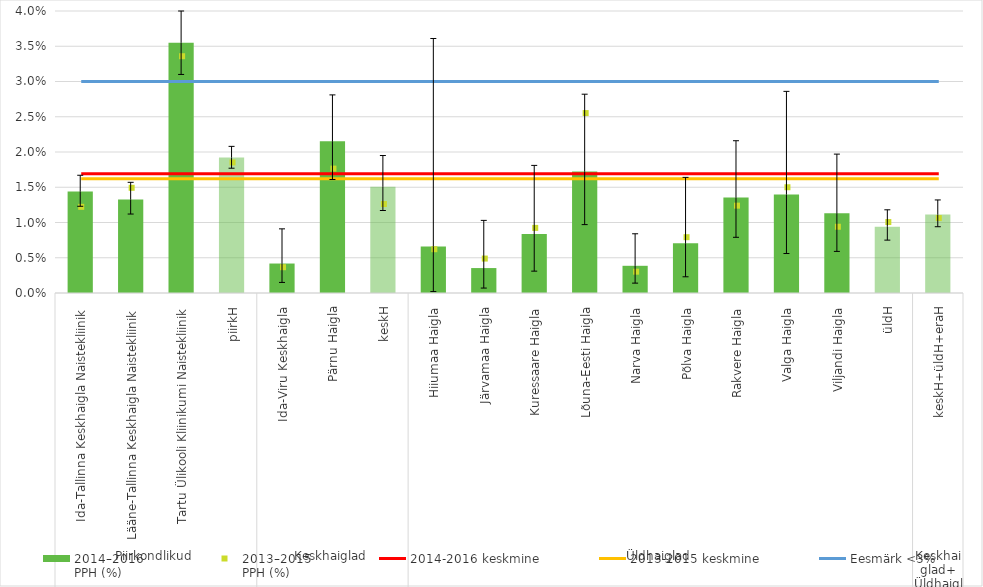
| Category | 2014–2016
PPH (%) |
|---|---|
| 0 | 0.014 |
| 1 | 0.013 |
| 2 | 0.036 |
| 3 | 0.019 |
| 4 | 0.004 |
| 5 | 0.022 |
| 6 | 0.015 |
| 7 | 0.007 |
| 8 | 0.004 |
| 9 | 0.008 |
| 10 | 0.017 |
| 11 | 0.004 |
| 12 | 0.007 |
| 13 | 0.014 |
| 14 | 0.014 |
| 15 | 0.011 |
| 16 | 0.009 |
| 17 | 0.011 |